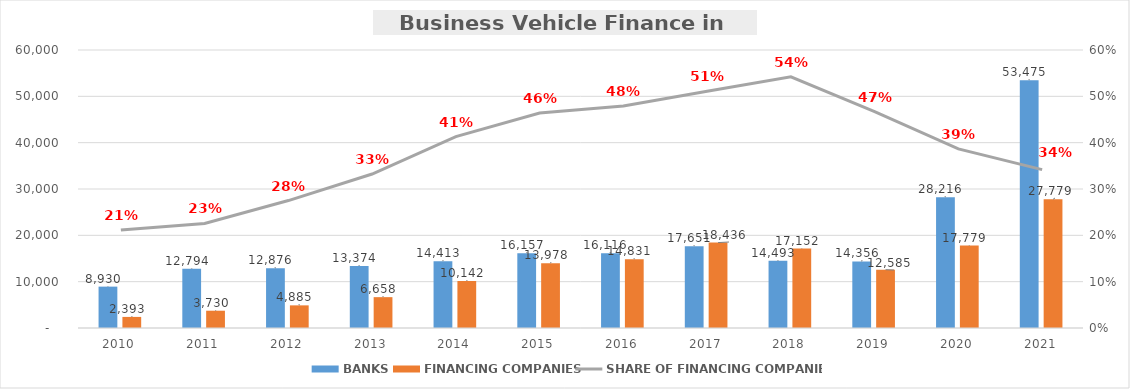
| Category | BANKS | FINANCING COMPANIES |
|---|---|---|
| 2010 | 8930.131 | 2392.721 |
| 2011 | 12793.723 | 3729.987 |
| 2012 | 12876.346 | 4885.495 |
| 2013 | 13374.424 | 6657.806 |
| 2014 | 14412.767 | 10141.887 |
| 2015 | 16157.225 | 13978.426 |
| 2016 | 16116.463 | 14831.249 |
| 2017 | 17650.963 | 18436.034 |
| 2018 | 14492.83 | 17152.034 |
| 2019 | 14355.978 | 12584.792 |
| 2020 | 28216.157 | 17779.072 |
| 2021 | 53475.488 | 27778.932 |